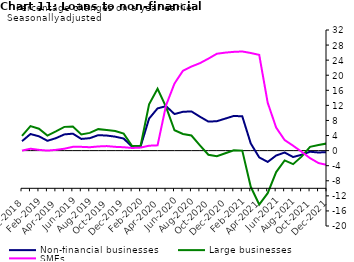
| Category | zero | Non-financial businesses | Large businesses | SMEs |
|---|---|---|---|---|
| Dec-2018 | 0 | 2.5 | 3.9 | 0 |
| Jan-2019 | 0 | 4.4 | 6.5 | 0.5 |
| Feb-2019 | 0 | 3.8 | 5.8 | 0.2 |
| Mar-2019 | 0 | 2.6 | 4 | 0 |
| Apr-2019 | 0 | 3.3 | 5.1 | 0.2 |
| May-2019 | 0 | 4.3 | 6.3 | 0.5 |
| Jun-2019 | 0 | 4.5 | 6.4 | 1 |
| Jul-2019 | 0 | 3.1 | 4.3 | 1 |
| Aug-2019 | 0 | 3.3 | 4.7 | 0.9 |
| Sep-2019 | 0 | 4.1 | 5.7 | 1.1 |
| Oct-2019 | 0 | 4 | 5.5 | 1.2 |
| Nov-2019 | 0 | 3.7 | 5.2 | 1 |
| Dec-2019 | 0 | 3.2 | 4.5 | 0.9 |
| Jan-2020 | 0 | 1 | 1.2 | 0.7 |
| Feb-2020 | 0 | 1.1 | 1.3 | 0.8 |
| Mar-2020 | 0 | 8.5 | 12.3 | 1.3 |
| Apr-2020 | 0 | 11.2 | 16.4 | 1.4 |
| May-2020 | 0 | 11.8 | 11.6 | 12 |
| Jun-2020 | 0 | 9.7 | 5.4 | 17.8 |
| Jul-2020 | 0 | 10.3 | 4.4 | 21.2 |
| Aug-2020 | 0 | 10.4 | 4 | 22.3 |
| Sep-2020 | 0 | 9 | 1.4 | 23.2 |
| Oct-2020 | 0 | 7.7 | -1.1 | 24.4 |
| Nov-2020 | 0 | 7.8 | -1.5 | 25.7 |
| Dec-2020 | 0 | 8.5 | -0.7 | 26 |
| Jan-2021 | 0 | 9.2 | 0.1 | 26.2 |
| Feb-2021 | 0 | 9.1 | 0 | 26.3 |
| Mar-2021 | 0 | 1.9 | -9.6 | 25.9 |
| Apr-2021 | 0 | -1.8 | -14.3 | 25.4 |
| May-2021 | 0 | -3 | -11.3 | 12.7 |
| Jun-2021 | 0 | -1.3 | -5.7 | 6.1 |
| Jul-2021 | 0 | -0.5 | -2.6 | 2.8 |
| Aug-2021 | 0 | -1.7 | -3.6 | 1.3 |
| Sep-2021 | 0 | -1.1 | -1.6 | -0.3 |
| Oct-2021 | 0 | -0.3 | 1 | -2 |
| Nov-2021 | 0 | -0.5 | 1.5 | -3.3 |
| Dec-2021 | 0 | -0.4 | 1.9 | -3.8 |